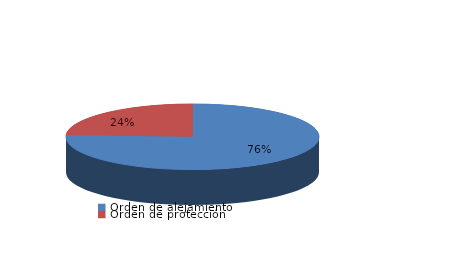
| Category | Series 0 |
|---|---|
| Orden de alejamiento | 22 |
| Orden de protección | 7 |